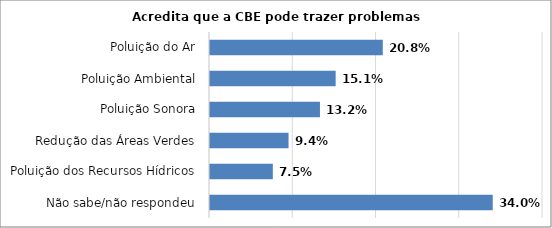
| Category | Series 0 |
|---|---|
| Não sabe/não respondeu | 0.34 |
| Poluição dos Recursos Hídricos | 0.075 |
| Redução das Áreas Verdes | 0.094 |
| Poluição Sonora | 0.132 |
| Poluição Ambiental | 0.151 |
| Poluição do Ar | 0.208 |